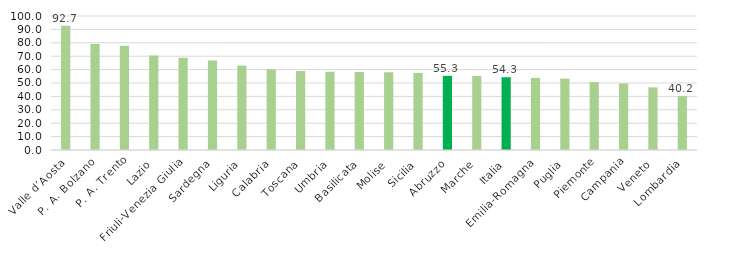
| Category | Series 0 |
|---|---|
| Valle d’Aosta | 92.737 |
| P. A. Bolzano | 79.016 |
| P. A. Trento | 77.708 |
| Lazio | 70.476 |
| Friuli-Venezia Giulia | 68.78 |
| Sardegna | 66.797 |
| Liguria | 62.972 |
| Calabria | 60.191 |
| Toscana | 58.913 |
| Umbria | 58.367 |
| Basilicata | 58.219 |
| Molise | 57.991 |
| Sicilia | 57.511 |
| Abruzzo | 55.338 |
| Marche | 55.23 |
| Italia | 54.3 |
| Emilia-Romagna | 53.783 |
| Puglia | 53.291 |
| Piemonte | 50.685 |
| Campania | 49.602 |
| Veneto | 46.744 |
| Lombardia | 40.172 |